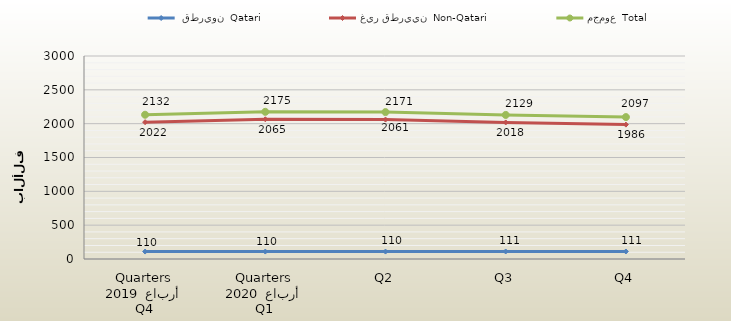
| Category |  قطريون  Qatari | غير قطريين  Non-Qatari | مجموع  Total |
|---|---|---|---|
| 0 | 110 | 2022 | 2132 |
| 1 | 110 | 2065 | 2175 |
| 2 | 110 | 2061 | 2171 |
| 3 | 111 | 2018 | 2129 |
| 4 | 111 | 1986 | 2097 |